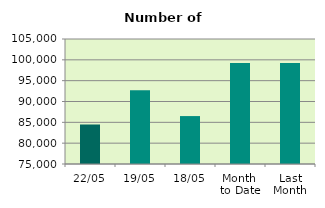
| Category | Series 0 |
|---|---|
| 22/05 | 84482 |
| 19/05 | 92708 |
| 18/05 | 86502 |
| Month 
to Date | 99230.8 |
| Last
Month | 99222.444 |